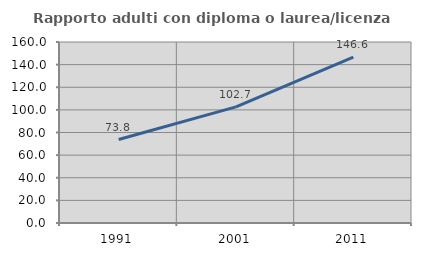
| Category | Rapporto adulti con diploma o laurea/licenza media  |
|---|---|
| 1991.0 | 73.77 |
| 2001.0 | 102.667 |
| 2011.0 | 146.591 |